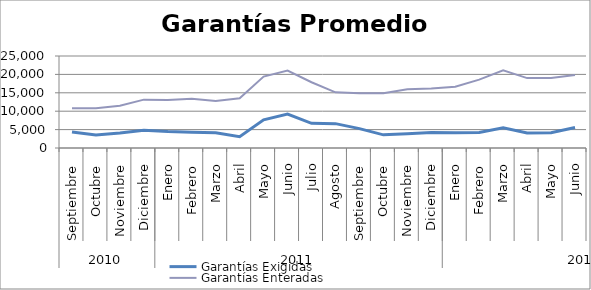
| Category | Garantías Exigidas | Garantías Enteradas |
|---|---|---|
| 0 | 4372.607 | 10829.062 |
| 1 | 3557.93 | 10787.9 |
| 2 | 4056.528 | 11463.422 |
| 3 | 4832.111 | 13142.881 |
| 4 | 4466.32 | 13061.162 |
| 5 | 4313.718 | 13357.444 |
| 6 | 4162.491 | 12796.251 |
| 7 | 3090.395 | 13495.263 |
| 8 | 7655.186 | 19416.342 |
| 9 | 9198.096 | 21035.301 |
| 10 | 6699.851 | 17866.843 |
| 11 | 6615.292 | 15119.839 |
| 12 | 5266.973 | 14911.639 |
| 13 | 3572.137 | 14861.465 |
| 14 | 3876.388 | 15976.819 |
| 15 | 4182.413 | 16147.351 |
| 16 | 4146.8 | 16662.483 |
| 17 | 4190.531 | 18572.749 |
| 18 | 5482.211 | 21128.648 |
| 19 | 4079.038 | 18997.51 |
| 20 | 4141.554 | 19005.364 |
| 21 | 5549.139 | 19818.91 |